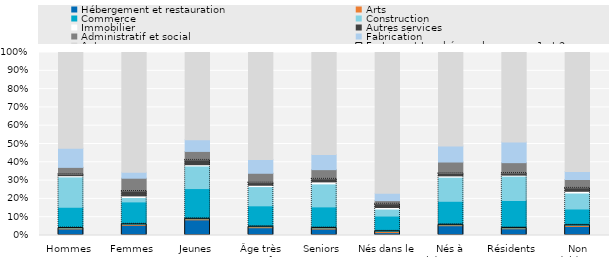
| Category |  Hébergement et restauration  |  Arts  |  Commerce  |  Construction  |  Immobilier  |  Autres services  |  Administratif et social  |  Fabrication  | Autre |
|---|---|---|---|---|---|---|---|---|---|
| Hommes | 0.036 | 0.005 | 0.113 | 0.166 | 0.007 | 0.008 | 0.038 | 0.105 | 0.523 |
| Femmes | 0.056 | 0.005 | 0.122 | 0.024 | 0.009 | 0.027 | 0.07 | 0.033 | 0.654 |
| Jeunes | 0.085 | 0.006 | 0.165 | 0.123 | 0.007 | 0.026 | 0.046 | 0.064 | 0.476 |
| Âge très actIf | 0.043 | 0.005 | 0.114 | 0.105 | 0.007 | 0.014 | 0.051 | 0.075 | 0.585 |
| Seniors | 0.035 | 0.006 | 0.115 | 0.126 | 0.011 | 0.017 | 0.05 | 0.082 | 0.558 |
| Nés dans le pays | 0.016 | 0.007 | 0.084 | 0.038 | 0.008 | 0.02 | 0.017 | 0.04 | 0.77 |
| Nés à l'étranger | 0.053 | 0.005 | 0.129 | 0.132 | 0.007 | 0.014 | 0.062 | 0.088 | 0.511 |
| Résidents | 0.037 | 0.004 | 0.15 | 0.133 | 0.005 | 0.011 | 0.057 | 0.113 | 0.489 |
| Non résidents | 0.05 | 0.006 | 0.089 | 0.087 | 0.009 | 0.019 | 0.046 | 0.044 | 0.65 |